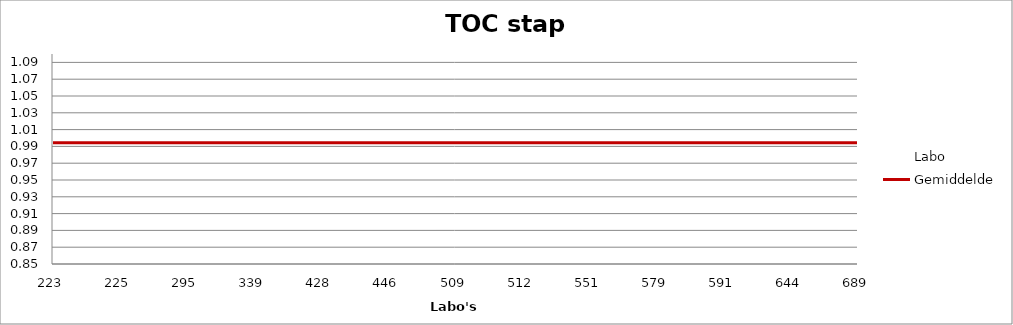
| Category | Labo | Gemiddelde |
|---|---|---|
| 223.0 | 0.966 | 0.994 |
| 225.0 | 0.995 | 0.994 |
| 295.0 | 0.979 | 0.994 |
| 339.0 | 1.004 | 0.994 |
| 428.0 | 1.001 | 0.994 |
| 446.0 | 0.97 | 0.994 |
| 509.0 | 0.983 | 0.994 |
| 512.0 | 1.022 | 0.994 |
| 551.0 | 1.017 | 0.994 |
| 579.0 | 0.965 | 0.994 |
| 591.0 | 1.002 | 0.994 |
| 644.0 | 1.012 | 0.994 |
| 689.0 | 0.97 | 0.994 |